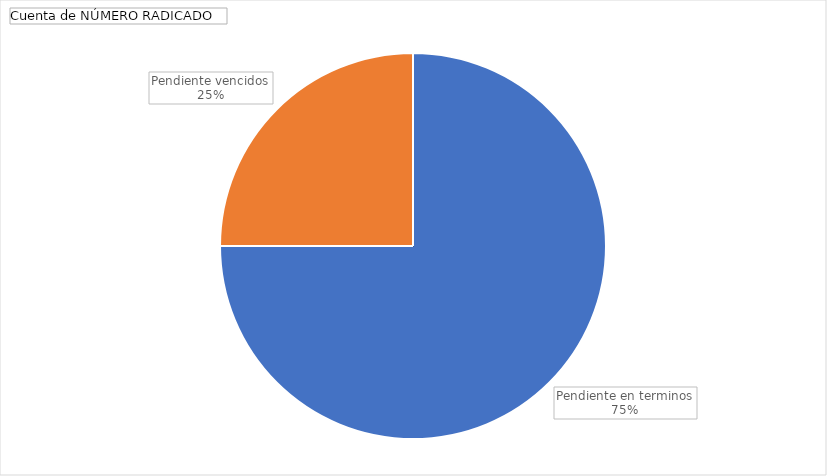
| Category | Total |
|---|---|
| Pendiente en terminos | 3 |
| Pendiente vencidos | 1 |